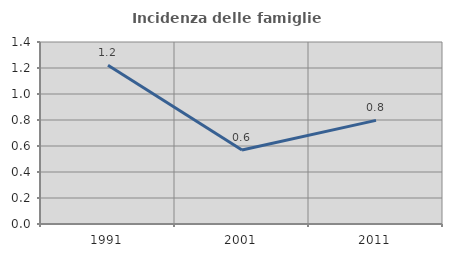
| Category | Incidenza delle famiglie numerose |
|---|---|
| 1991.0 | 1.221 |
| 2001.0 | 0.569 |
| 2011.0 | 0.797 |